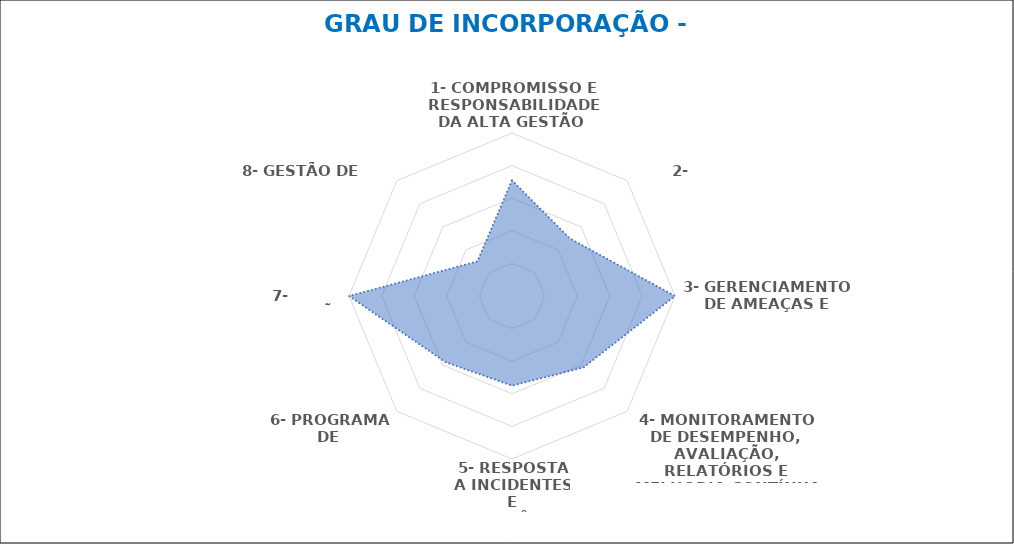
| Category | Grau de Incorporação |
|---|---|
| 1- COMPROMISSO E RESPONSABILIDADE DA ALTA GESTÃO  | 0.71 |
| 2- RECURSOS | 0.5 |
| 3- GERENCIAMENTO DE AMEAÇAS E RISCOS | 1 |
| 4- MONITORAMENTO DE DESEMPENHO, AVALIAÇÃO, RELATÓRIOS E MELHORIA CONTÍNUA | 0.62 |
| 5- RESPOSTA A INCIDENTES E OCORRÊNCIAS | 0.55 |
| 6- PROGRAMA DE TREINAMENTO | 0.575 |
| 7- COMUNICAÇÃO | 1 |
| 8- GESTÃO DE MUDANÇA | 0.3 |